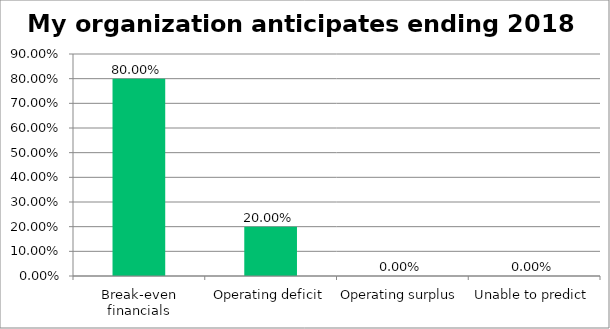
| Category | Responses |
|---|---|
| Break-even financials | 0.8 |
| Operating deficit | 0.2 |
| Operating surplus | 0 |
| Unable to predict | 0 |